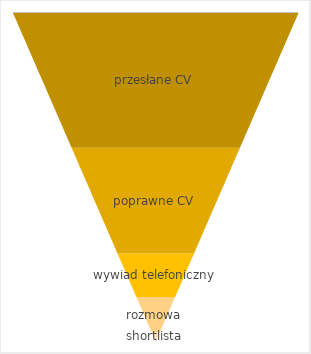
| Category | przesłane CV | poprawne CV | wywiad telefoniczny | rozmowa | shortlista |
|---|---|---|---|---|---|
| 0 | 74 | 58 | 24 | 19 | 5 |